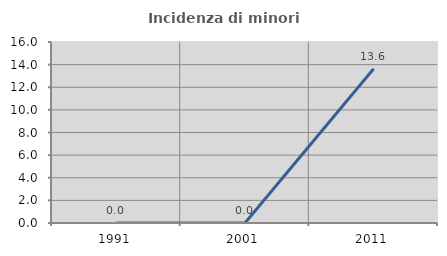
| Category | Incidenza di minori stranieri |
|---|---|
| 1991.0 | 0 |
| 2001.0 | 0 |
| 2011.0 | 13.636 |